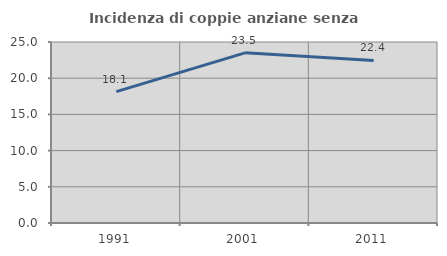
| Category | Incidenza di coppie anziane senza figli  |
|---|---|
| 1991.0 | 18.14 |
| 2001.0 | 23.5 |
| 2011.0 | 22.449 |